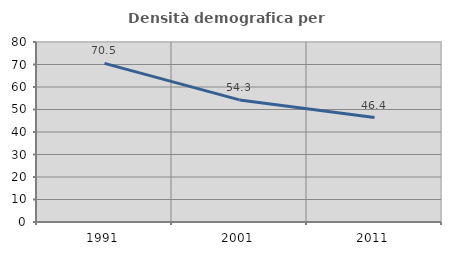
| Category | Densità demografica |
|---|---|
| 1991.0 | 70.491 |
| 2001.0 | 54.264 |
| 2011.0 | 46.413 |